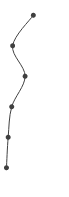
| Category | Series 0 |
|---|---|
| 0.4473879560863513 | 1 |
| 0.10757190459591409 | 2 |
| 0.31200291924112583 | 3 |
| 0.09255465488767098 | 4 |
| 0.03429551469712723 | 5 |
| 0.006079113127153128 | 6 |